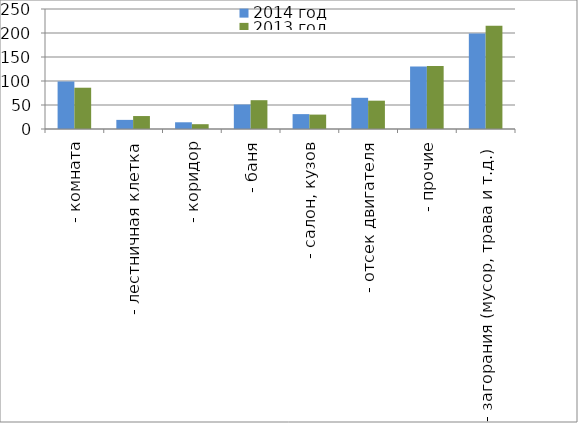
| Category | 2014 год | 2013 год |
|---|---|---|
|  - комната | 99 | 86 |
|  - лестничная клетка | 19 | 27 |
|  - коридор | 14 | 10 |
|  - баня | 51 | 60 |
|  - салон, кузов | 31 | 30 |
|  - отсек двигателя | 65 | 59 |
| - прочие | 130 | 131 |
| - загорания (мусор, трава и т.д.)  | 199 | 215 |